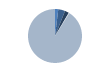
| Category | Series 0 |
|---|---|
| ARRASTRE | 22 |
| CERCO | 46 |
| PALANGRE | 28 |
| REDES DE ENMALLE | 4 |
| ARTES MENORES | 1021 |
| SIN TIPO ASIGNADO | 0 |